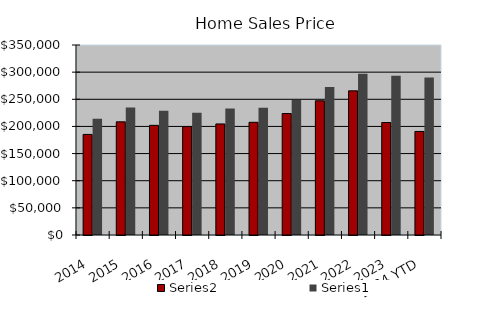
| Category | Series 1 | Series 0 |
|---|---|---|
| 2014 | 185264.75 | 214100.917 |
| 2015 | 208438 | 234978.917 |
| 2016 | 201992.583 | 229052.833 |
| 2017 | 199719.333 | 225120.667 |
| 2018 | 204587.25 | 232879.083 |
| 2019 | 207587.417 | 234221.583 |
| 2020 | 223776.25 | 248640.667 |
| 2021 | 247265.5 | 272817.917 |
| 2022 | 265530.083 | 296980.833 |
| 2023 | 207227.083 | 293494.833 |
| 2024 YTD | 190752 | 290093.5 |